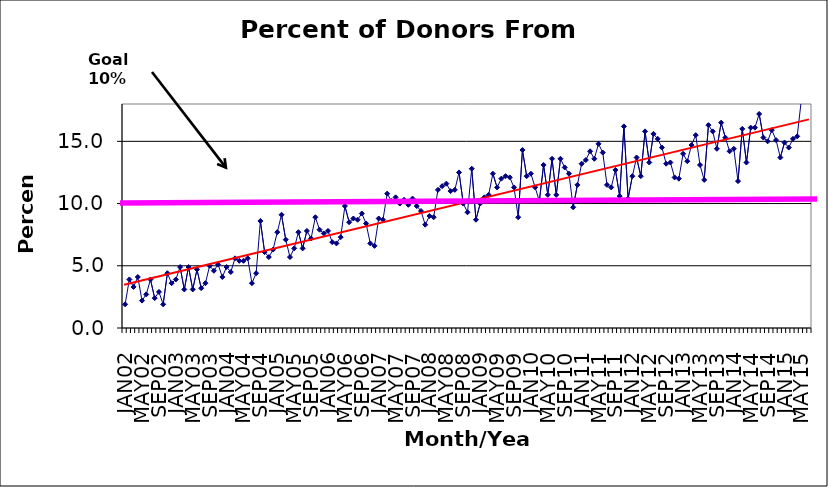
| Category | Series 0 |
|---|---|
| JAN02 | 1.9 |
| FEB02 | 3.9 |
| MAR02 | 3.3 |
| APR02 | 4.1 |
| MAY02 | 2.2 |
| JUN02 | 2.7 |
| JUL02 | 3.9 |
| AUG02 | 2.4 |
| SEP02 | 2.9 |
| OCT02 | 1.9 |
| NOV02 | 4.4 |
| DEC02 | 3.6 |
| JAN03 | 3.9 |
| FEB03 | 4.9 |
| MAR03 | 3.1 |
| APR03 | 4.9 |
| MAY03 | 3.1 |
| JUN03 | 4.7 |
| JUL03 | 3.2 |
| AUG03 | 3.6 |
| SEP03 | 5 |
| OCT03 | 4.6 |
| NOV03 | 5.1 |
| DEC03 | 4.1 |
| JAN04 | 4.9 |
| FEB04 | 4.5 |
| MAR04 | 5.6 |
| APR04 | 5.4 |
| MAY04 | 5.4 |
| JUN04 | 5.6 |
| JUL04 | 3.6 |
| AUG04 | 4.4 |
| SEP04 | 8.6 |
| OCT04 | 6.1 |
| NOV04 | 5.7 |
| DEC04 | 6.3 |
| JAN05 | 7.7 |
| FEB05 | 9.1 |
| MAR05 | 7.1 |
| APR05 | 5.7 |
| MAY05 | 6.4 |
| JUN05 | 7.7 |
| JUL05 | 6.4 |
| AUG05 | 7.8 |
| SEP05 | 7.2 |
| OCT05 | 8.9 |
| NOV05 | 7.9 |
| DEC05 | 7.6 |
| JAN06 | 7.8 |
| FEB06 | 6.9 |
| MAR06 | 6.8 |
| APR06 | 7.3 |
| MAY06 | 9.8 |
| JUN06 | 8.5 |
| JUL06 | 8.8 |
| AUG06 | 8.7 |
| SEP06 | 9.2 |
| OCT06 | 8.4 |
| NOV06 | 6.8 |
| DEC06 | 6.6 |
| JAN07 | 8.8 |
| FEB07 | 8.7 |
| MAR07 | 10.8 |
| APR07 | 10.2 |
| MAY07 | 10.5 |
| JUN07 | 10 |
| JUL07 | 10.3 |
| AUG07 | 9.9 |
| SEP07 | 10.4 |
| OCT07 | 9.8 |
| NOV07 | 9.4 |
| DEC07 | 8.3 |
| JAN08 | 9 |
| FEB08 | 8.9 |
| MAR08 | 11.1 |
| APR08 | 11.4 |
| MAY08 | 11.6 |
| JUN08 | 11 |
| JUL08 | 11.1 |
| AUG08 | 12.5 |
| SEP08 | 10 |
| OCT08 | 9.3 |
| NOV08 | 12.8 |
| DEC08 | 8.7 |
| JAN09 | 10 |
| FEB09 | 10.5 |
| MAR09 | 10.7 |
| APR09 | 12.4 |
| MAY09 | 11.3 |
| JUN09 | 12 |
| JUL09 | 12.2 |
| AUG09 | 12.1 |
| SEP09 | 11.3 |
| OCT09 | 8.9 |
| NOV09 | 14.3 |
| DEC09 | 12.2 |
| JAN10 | 12.4 |
| FEB10 | 11.3 |
| MAR10 | 10.2 |
| APR10 | 13.1 |
| MAY10 | 10.7 |
| JUN10 | 13.6 |
| JUL10 | 10.7 |
| AUG10 | 13.6 |
| SEP10 | 12.9 |
| OCT10 | 12.4 |
| NOV10 | 9.7 |
| DEC10 | 11.5 |
| JAN11 | 13.2 |
| FEB11 | 13.5 |
| MAR11 | 14.2 |
| APR11 | 13.6 |
| MAY11 | 14.8 |
| JUN11 | 14.1 |
| JUL11 | 11.5 |
| AUG11 | 11.3 |
| SEP11 | 12.7 |
| OCT11 | 10.6 |
| NOV11 | 16.2 |
| DEC11 | 10.4 |
| JAN12 | 12.2 |
| FEB12 | 13.7 |
| MAR12 | 12.2 |
| APR12 | 15.8 |
| MAY12 | 13.3 |
| JUN12 | 15.6 |
| JUL12 | 15.2 |
| AUG12 | 14.5 |
| SEP12 | 13.2 |
| OCT12 | 13.3 |
| NOV12 | 12.1 |
| DEC12 | 12 |
| JAN13 | 14 |
| FEB13 | 13.4 |
| MAR13 | 14.7 |
| APR13 | 15.5 |
| MAY13 | 13.1 |
| JUN13 | 11.9 |
| JUL13 | 16.3 |
| AUG13 | 15.8 |
| SEP13 | 14.4 |
| OCT13 | 16.5 |
| NOV13 | 15.3 |
| DEC13 | 14.2 |
| JAN14 | 14.4 |
| FEB14 | 11.8 |
| MAR14 | 16 |
| APR14 | 13.3 |
| MAY14 | 16.1 |
| JUN14 | 16.1 |
| JUL14 | 17.2 |
| AUG14 | 15.3 |
| SEP14 | 15 |
| OCT14 | 15.9 |
| NOV14 | 15.1 |
| DEC14 | 13.7 |
| JAN15 | 14.9 |
| FEB15 | 14.5 |
| MAR15 | 15.2 |
| APR15 | 15.4 |
| MAY15 | 18.4 |